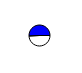
| Category | Series 0 |
|---|---|
| 0 | 3692814 |
| 1 | 3810954 |